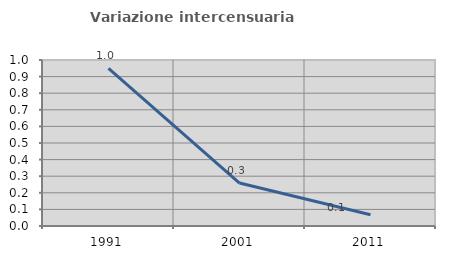
| Category | Variazione intercensuaria annua |
|---|---|
| 1991.0 | 0.95 |
| 2001.0 | 0.259 |
| 2011.0 | 0.068 |